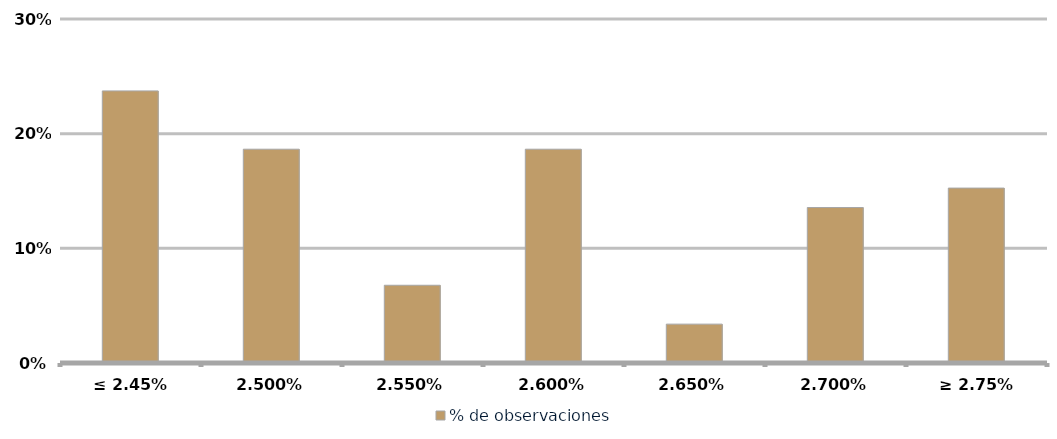
| Category | % de observaciones  |
|---|---|
| ≤ 2.45% | 0.237 |
| 2.50% | 0.186 |
| 2.55% | 0.068 |
| 2.60% | 0.186 |
| 2.65% | 0.034 |
| 2.70% | 0.136 |
| ≥ 2.75% | 0.153 |